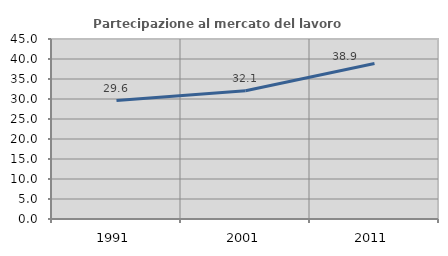
| Category | Partecipazione al mercato del lavoro  femminile |
|---|---|
| 1991.0 | 29.597 |
| 2001.0 | 32.081 |
| 2011.0 | 38.885 |